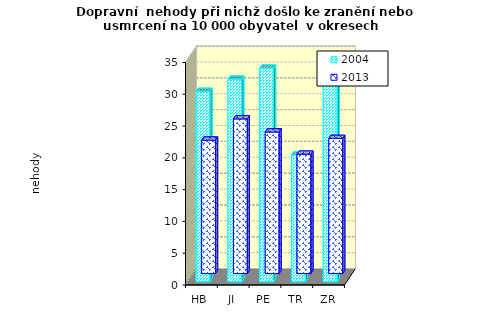
| Category | 2004 | 2013 |
|---|---|---|
| HB | 29.947 | 20.979 |
| JI | 31.867 | 24.32 |
| PE | 33.599 | 22.261 |
| TR | 19.928 | 18.762 |
| ZR | 32.096 | 21.243 |